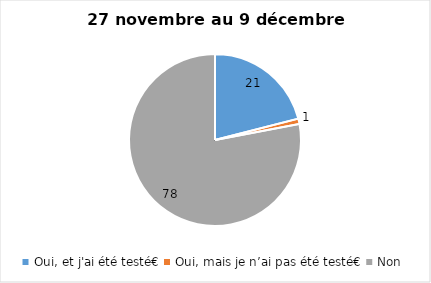
| Category | Series 0 |
|---|---|
| Oui, et j'ai été testé€ | 21 |
| Oui, mais je n’ai pas été testé€ | 1 |
| Non | 78 |